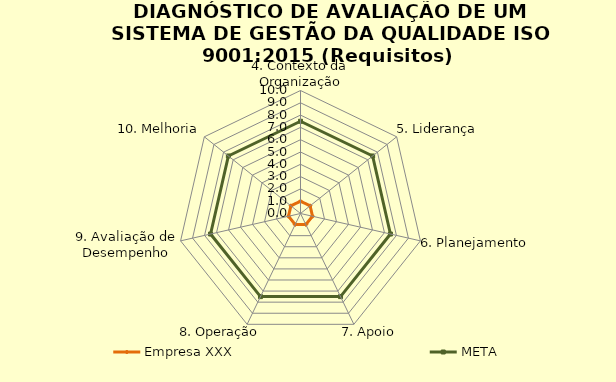
| Category | Empresa XXX | META |
|---|---|---|
| 4. Contexto da Organização | 1 | 7.5 |
| 5. Liderança | 1 | 7.5 |
| 6. Planejamento | 1 | 7.5 |
| 7. Apoio | 1 | 7.5 |
| 8. Operação | 1 | 7.5 |
| 9. Avaliação de Desempenho | 1 | 7.5 |
| 10. Melhoria | 1 | 7.5 |